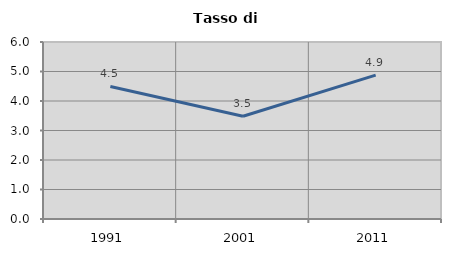
| Category | Tasso di disoccupazione   |
|---|---|
| 1991.0 | 4.494 |
| 2001.0 | 3.483 |
| 2011.0 | 4.878 |